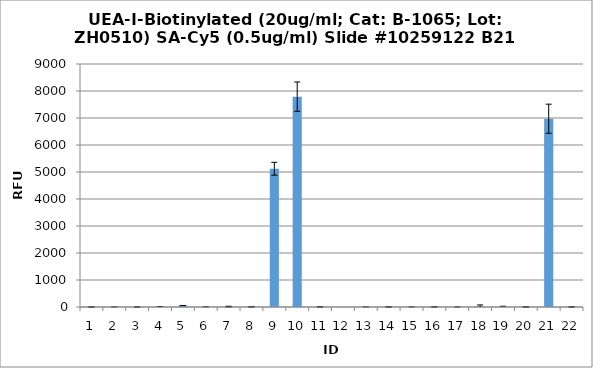
| Category | Series 0 |
|---|---|
| 0 | -0.5 |
| 1 | 1.75 |
| 2 | 0.5 |
| 3 | 6.5 |
| 4 | 55.75 |
| 5 | 4 |
| 6 | 14.25 |
| 7 | 7.25 |
| 8 | 5120.5 |
| 9 | 7791.5 |
| 10 | 4.25 |
| 11 | -5 |
| 12 | 1 |
| 13 | 2 |
| 14 | 0.75 |
| 15 | 5.25 |
| 16 | 1 |
| 17 | 28.75 |
| 18 | 13 |
| 19 | 1.5 |
| 20 | 6973.5 |
| 21 | -0.5 |